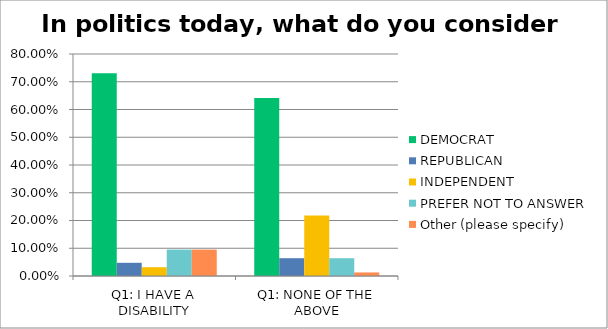
| Category | DEMOCRAT | REPUBLICAN | INDEPENDENT | PREFER NOT TO ANSWER | Other (please specify) |
|---|---|---|---|---|---|
| Q1: I HAVE A DISABILITY | 0.73 | 0.048 | 0.032 | 0.095 | 0.095 |
| Q1: NONE OF THE ABOVE | 0.641 | 0.064 | 0.218 | 0.064 | 0.013 |